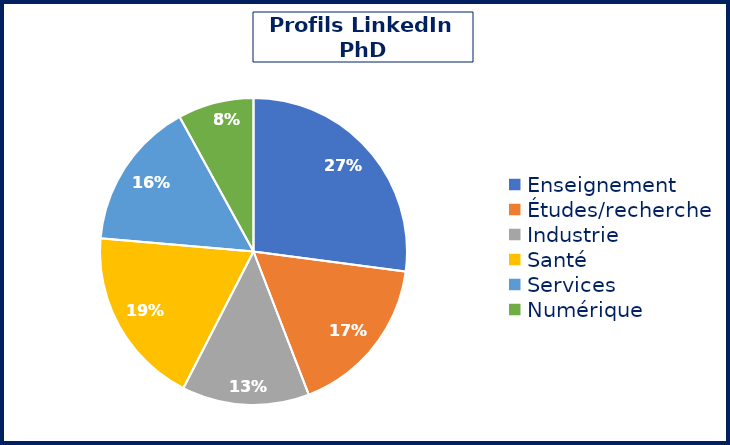
| Category | Series 0 |
|---|---|
| Enseignement | 305 |
| Études/recherche | 192 |
| Industrie | 151 |
| Santé | 212 |
| Services | 176 |
| Numérique | 90 |